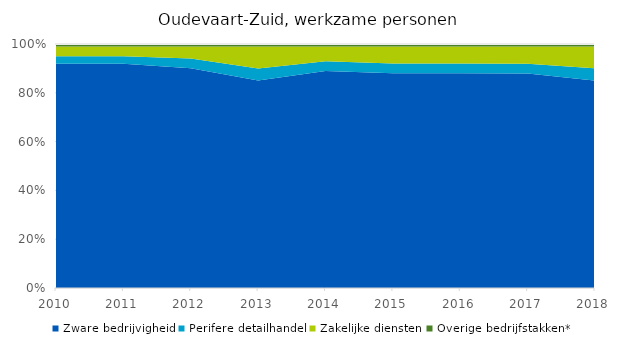
| Category | Zware bedrijvigheid | Perifere detailhandel | Zakelijke diensten | Overige bedrijfstakken* |
|---|---|---|---|---|
| 2010 | 0.91 | 0.03 | 0.04 | 0.01 |
| 2011 | 0.91 | 0.03 | 0.04 | 0.01 |
| 2012 | 0.91 | 0.04 | 0.05 | 0.01 |
| 2013 | 0.85 | 0.05 | 0.09 | 0.01 |
| 2014 | 0.88 | 0.04 | 0.06 | 0.01 |
| 2015 | 0.88 | 0.04 | 0.07 | 0.01 |
| 2016 | 0.88 | 0.04 | 0.07 | 0.01 |
| 2017 | 0.87 | 0.04 | 0.07 | 0.01 |
| 2018 | 0.85 | 0.05 | 0.09 | 0.01 |